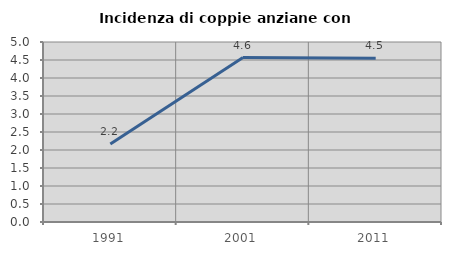
| Category | Incidenza di coppie anziane con figli |
|---|---|
| 1991.0 | 2.166 |
| 2001.0 | 4.567 |
| 2011.0 | 4.545 |